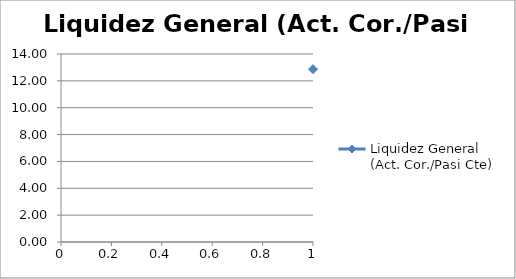
| Category | Liquidez General (Act. Cor./Pasi Cte) |
|---|---|
| 0 | 12.868 |
| 1 | 12.835 |
| 2 | 12.046 |
| 3 | 11.963 |
| 4 | 12.61 |
| 5 | 12.512 |
| 6 | 11.764 |
| 7 | 7.966 |